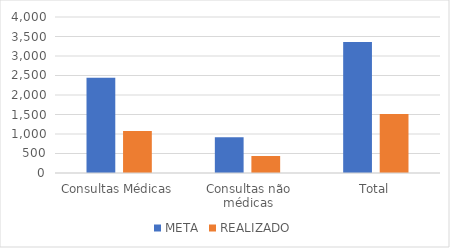
| Category | META | REALIZADO |
|---|---|---|
| Consultas Médicas | 2442 | 1078 |
| Consultas não médicas | 916 | 436 |
| Total | 3358 | 1514 |